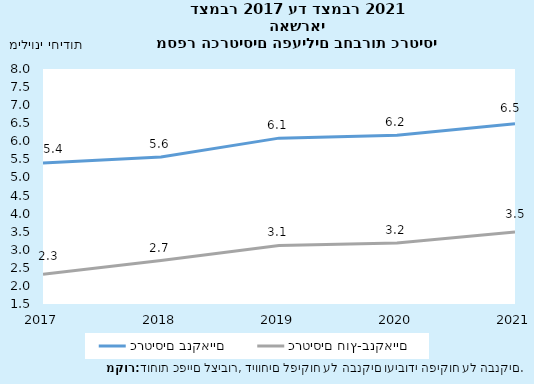
| Category | כרטיסים בנקאיים | כרטיסים חוץ-בנקאיים |
|---|---|---|
| 2017-12-31 | 5.402 | 2.322 |
| 2018-12-31 | 5.566 | 2.701 |
| 2019-12-31 | 6.088 | 3.119 |
| 2020-12-31 | 6.167 | 3.187 |
| 2021-12-31 | 6.487 | 3.494 |